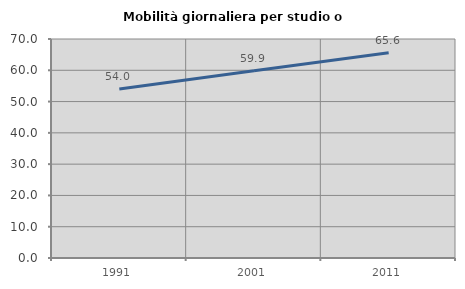
| Category | Mobilità giornaliera per studio o lavoro |
|---|---|
| 1991.0 | 54.049 |
| 2001.0 | 59.887 |
| 2011.0 | 65.576 |